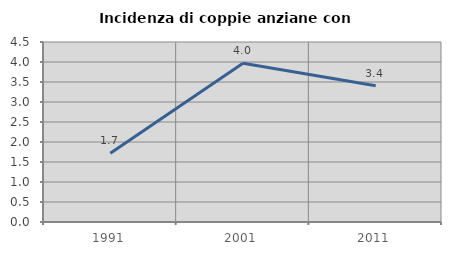
| Category | Incidenza di coppie anziane con figli |
|---|---|
| 1991.0 | 1.718 |
| 2001.0 | 3.971 |
| 2011.0 | 3.405 |